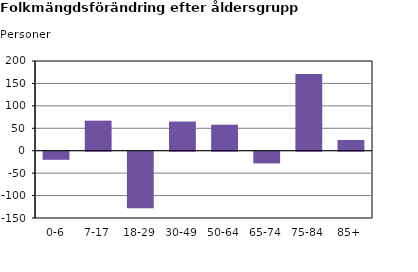
| Category | Series 2 |
|---|---|
| 0-6 | -18 |
| 7-17 | 67 |
| 18-29 | -126 |
| 30-49 | 65 |
| 50-64 | 58 |
| 65-74 | -26 |
| 75-84 | 171 |
| 85+ | 24 |